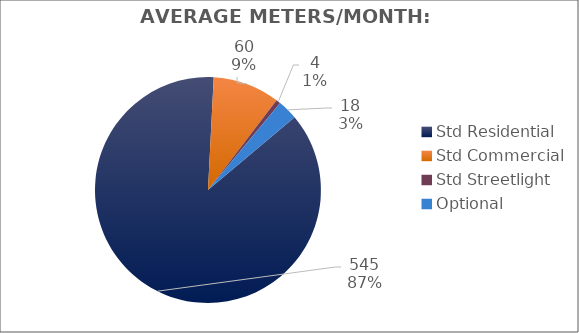
| Category | Meters |
|---|---|
| Std Residential | 545 |
| Std Commercial | 60 |
| Std Streetlight | 4 |
| Optional | 18 |